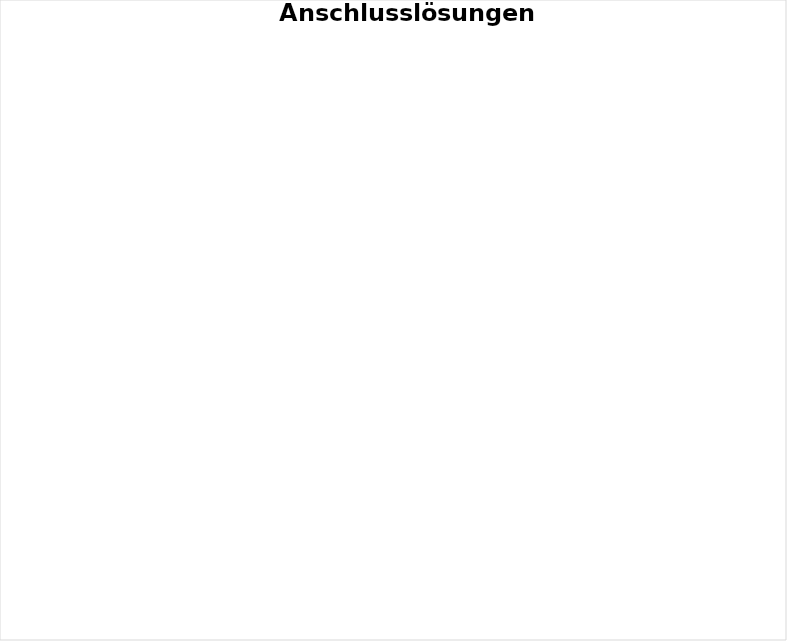
| Category | Series 0 |
|---|---|
| Wohnen in eigener (selbstfinanzierter) Wohnung | 0 |
| Wohnen im institutionellen Rahmen | 0 |
| Wohnen bei Eltern / Angehörigen | 0 |
| Klinikaufenthalt | 0 |
| Andere Lösung (WG, Lerlingsunterkunft, etc) | 0 |